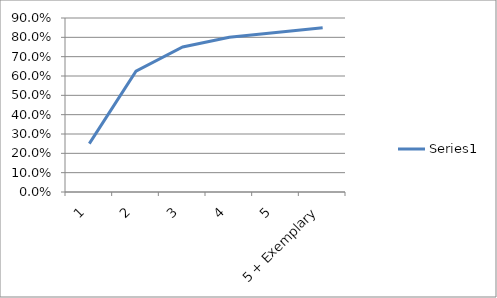
| Category | Series 0 |
|---|---|
| 1 | 0.25 |
| 2 | 0.625 |
| 3 | 0.75 |
| 4 | 0.8 |
| 5 | 0.825 |
| 5 + Exemplary | 0.85 |